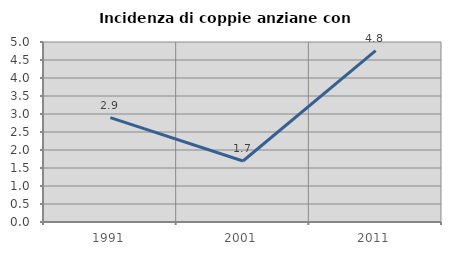
| Category | Incidenza di coppie anziane con figli |
|---|---|
| 1991.0 | 2.899 |
| 2001.0 | 1.695 |
| 2011.0 | 4.762 |